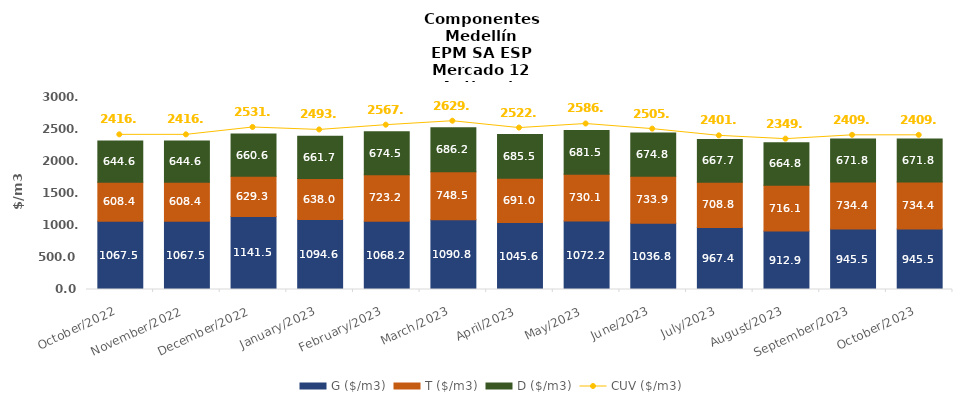
| Category | G ($/m3) | T ($/m3) | D ($/m3) |
|---|---|---|---|
| 2022-10-01 | 1067.51 | 608.44 | 644.64 |
| 2022-11-01 | 1067.51 | 608.44 | 644.64 |
| 2022-12-01 | 1141.53 | 629.26 | 660.56 |
| 2023-01-01 | 1094.64 | 637.95 | 661.67 |
| 2023-02-01 | 1068.19 | 723.22 | 674.52 |
| 2023-03-01 | 1090.77 | 748.48 | 686.22 |
| 2023-04-01 | 1045.58 | 690.98 | 685.49 |
| 2023-05-01 | 1072.19 | 730.14 | 681.45 |
| 2023-06-01 | 1036.8 | 733.9 | 674.81 |
| 2023-07-01 | 967.35 | 708.84 | 667.66 |
| 2023-08-01 | 912.93 | 716.07 | 664.76 |
| 2023-09-01 | 945.5 | 734.35 | 671.79 |
| 2023-10-01 | 945.5 | 734.35 | 671.79 |